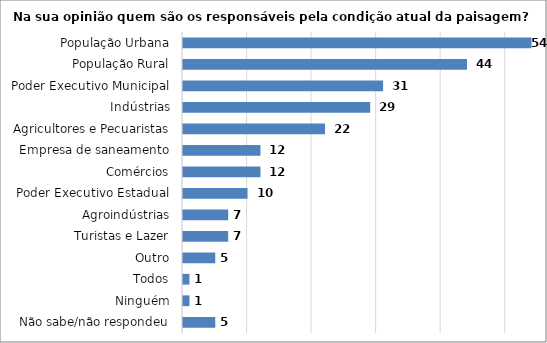
| Category | Series 0 |
|---|---|
| Não sabe/não respondeu | 5 |
| Ninguém | 1 |
| Todos | 1 |
| Outro | 5 |
| Turistas e Lazer | 7 |
| Agroindústrias | 7 |
| Poder Executivo Estadual | 10 |
| Comércios | 12 |
| Empresa de saneamento | 12 |
| Agricultores e Pecuaristas | 22 |
| Indústrias | 29 |
| Poder Executivo Municipal | 31 |
| População Rural | 44 |
| População Urbana | 54 |